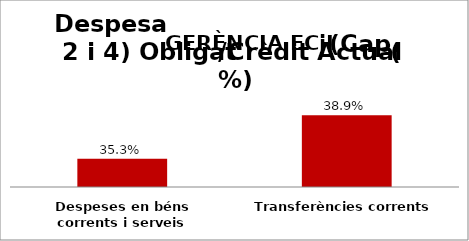
| Category | Series 0 |
|---|---|
| Despeses en béns corrents i serveis | 0.353 |
| Transferències corrents | 0.389 |